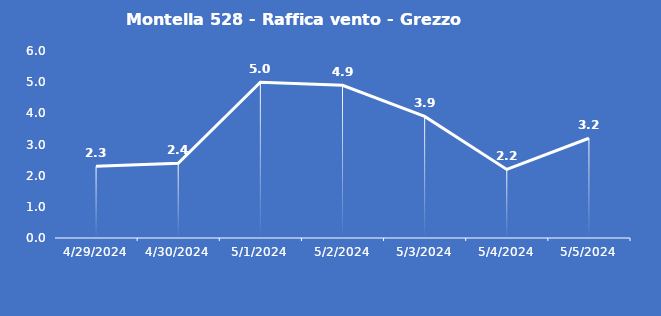
| Category | Montella 528 - Raffica vento - Grezzo (m/s) |
|---|---|
| 4/29/24 | 2.3 |
| 4/30/24 | 2.4 |
| 5/1/24 | 5 |
| 5/2/24 | 4.9 |
| 5/3/24 | 3.9 |
| 5/4/24 | 2.2 |
| 5/5/24 | 3.2 |